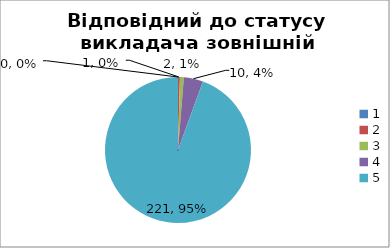
| Category | Кількість | % |
|---|---|---|
| 0 | 0 | 0 |
| 1 | 1 | 0.004 |
| 2 | 2 | 0.009 |
| 3 | 10 | 0.043 |
| 4 | 221 | 0.944 |